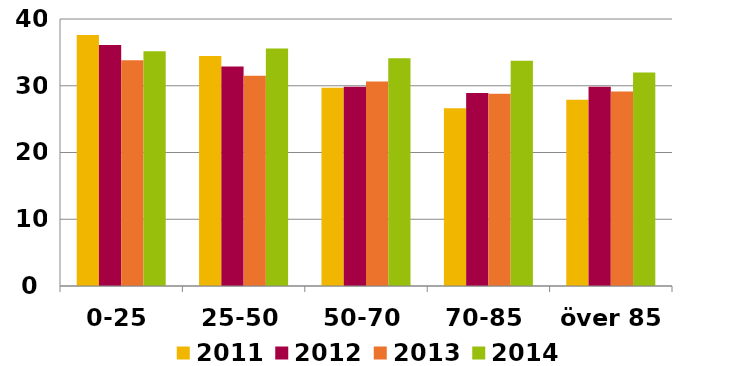
| Category | 2011 | 2012 | 2013 | 2014 |
|---|---|---|---|---|
| 0-25 | 37.585 | 36.116 | 33.834 | 35.152 |
| 25-50 | 34.444 | 32.875 | 31.481 | 35.578 |
| 50-70 | 29.71 | 29.851 | 30.626 | 34.106 |
| 70-85 | 26.625 | 28.909 | 28.805 | 33.738 |
| över 85 | 27.901 | 29.838 | 29.156 | 31.979 |